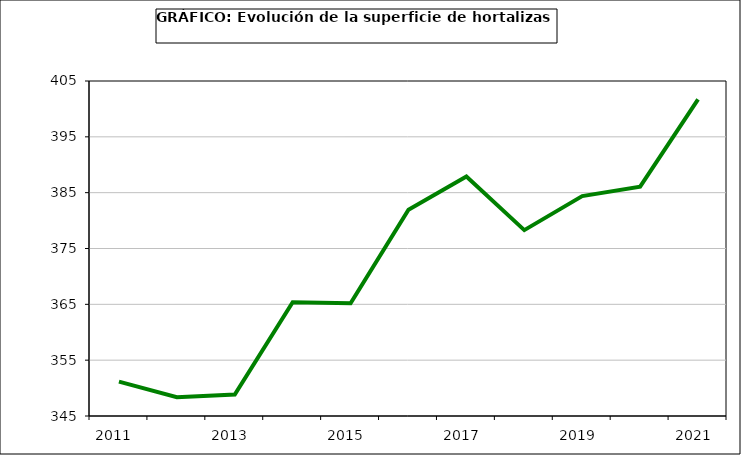
| Category | superficie |
|---|---|
| 2011.0 | 351.145 |
| 2012.0 | 348.359 |
| 2013.0 | 348.853 |
| 2014.0 | 365.385 |
| 2015.0 | 365.178 |
| 2016.0 | 381.94 |
| 2017.0 | 387.895 |
| 2018.0 | 378.294 |
| 2019.0 | 384.392 |
| 2020.0 | 386.084 |
| 2021.0 | 401.711 |